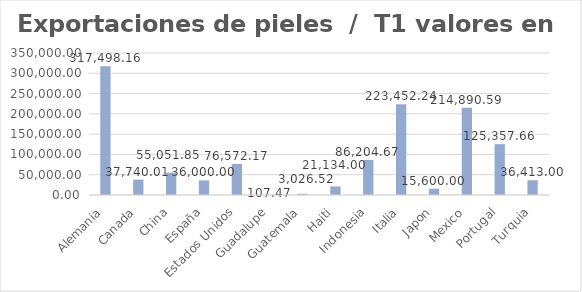
| Category | Valor US  |
|---|---|
| Alemania | 317498.156 |
| Canada | 37740.011 |
| China | 55051.852 |
| España | 36000 |
| Estados Unidos | 76572.17 |
| Guadalupe | 107.47 |
| Guatemala | 3026.52 |
| Haiti | 21134 |
| Indonesia | 86204.668 |
| Italia | 223452.242 |
| Japon | 15600 |
| Mexico | 214890.594 |
| Portugal | 125357.657 |
| Turquia | 36413 |